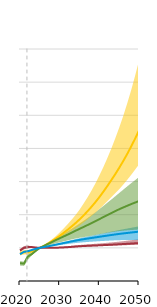
| Category | Reference |
|---|---|
| 2020.0 | 0.808 |
| 2021.0 | 0.88 |
| 2022.0 | 0.898 |
| 2023.0 | 0.936 |
| 2024.0 | 0.971 |
| 2025.0 | 1 |
| 2026.0 | 1.024 |
| 2027.0 | 1.046 |
| 2028.0 | 1.07 |
| 2029.0 | 1.095 |
| 2030.0 | 1.12 |
| 2031.0 | 1.145 |
| 2032.0 | 1.17 |
| 2033.0 | 1.195 |
| 2034.0 | 1.218 |
| 2035.0 | 1.24 |
| 2036.0 | 1.26 |
| 2037.0 | 1.279 |
| 2038.0 | 1.298 |
| 2039.0 | 1.316 |
| 2040.0 | 1.334 |
| 2041.0 | 1.352 |
| 2042.0 | 1.37 |
| 2043.0 | 1.387 |
| 2044.0 | 1.404 |
| 2045.0 | 1.421 |
| 2046.0 | 1.435 |
| 2047.0 | 1.449 |
| 2048.0 | 1.463 |
| 2049.0 | 1.476 |
| 2050.0 | 1.489 |